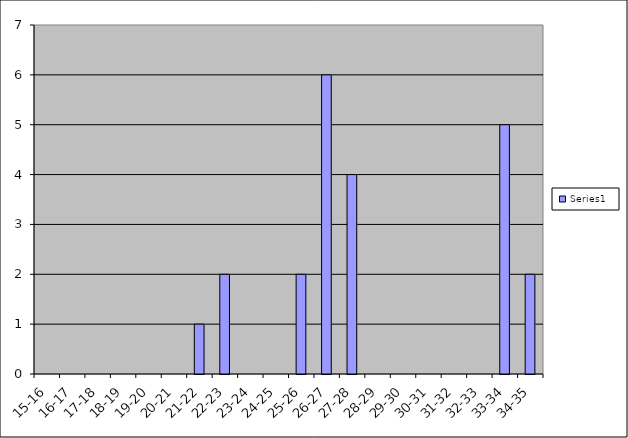
| Category | Series 0 |
|---|---|
| 15-16 | 0 |
| 16-17 | 0 |
| 17-18 | 0 |
| 18-19 | 0 |
| 19-20 | 0 |
| 20-21 | 0 |
| 21-22 | 1 |
| 22-23 | 2 |
| 23-24 | 0 |
| 24-25 | 0 |
| 25-26 | 2 |
| 26-27 | 6 |
| 27-28 | 4 |
| 28-29 | 0 |
| 29-30 | 0 |
| 30-31 | 0 |
| 31-32 | 0 |
| 32-33 | 0 |
| 33-34 | 5 |
| 34-35 | 2 |